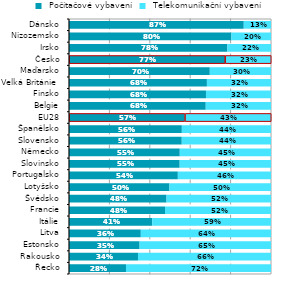
| Category |  Počítačové vybavení |  Telekomunikační vybavení |
|---|---|---|
| Řecko | 0.282 | 0.718 |
| Rakousko | 0.341 | 0.659 |
| Estonsko | 0.349 | 0.651 |
| Litva | 0.355 | 0.645 |
| Itálie | 0.412 | 0.588 |
| Francie | 0.475 | 0.525 |
| Švédsko | 0.483 | 0.517 |
| Lotyšsko | 0.497 | 0.503 |
| Portugalsko | 0.539 | 0.461 |
| Slovinsko | 0.548 | 0.452 |
| Německo | 0.548 | 0.452 |
| Slovensko | 0.558 | 0.442 |
| Španělsko | 0.559 | 0.441 |
| EU28 | 0.573 | 0.427 |
| Belgie | 0.677 | 0.323 |
| Finsko | 0.678 | 0.322 |
| Velká Británie  | 0.683 | 0.317 |
| Maďarsko | 0.697 | 0.303 |
| Česko | 0.772 | 0.228 |
| Irsko | 0.784 | 0.216 |
| Nizozemsko | 0.804 | 0.196 |
| Dánsko | 0.865 | 0.135 |